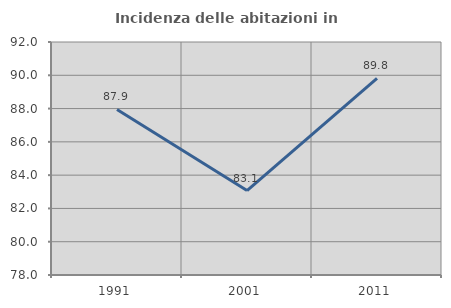
| Category | Incidenza delle abitazioni in proprietà  |
|---|---|
| 1991.0 | 87.945 |
| 2001.0 | 83.073 |
| 2011.0 | 89.812 |